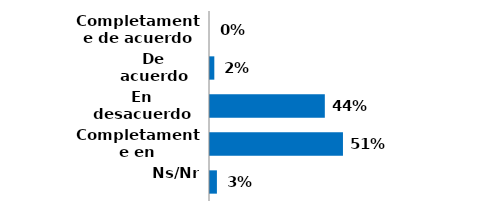
| Category | Series 0 |
|---|---|
| Completamente de acuerdo | 0 |
| De acuerdo | 0.017 |
| En desacuerdo | 0.443 |
| Completamente en desacuerdo | 0.513 |
| Ns/Nr | 0.027 |